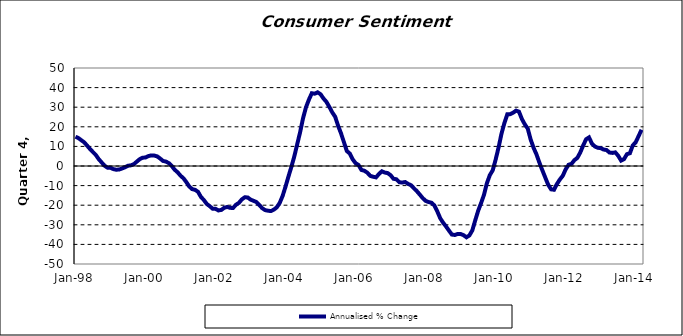
| Category | Annualised % Change |
|---|---|
| 1998-01-01 | 14.944 |
| 1998-02-01 | 14.272 |
| 1998-03-01 | 13.138 |
| 1998-04-01 | 12.079 |
| 1998-05-01 | 10.382 |
| 1998-06-01 | 8.64 |
| 1998-07-01 | 7.113 |
| 1998-08-01 | 5.581 |
| 1998-09-01 | 3.453 |
| 1998-10-01 | 1.768 |
| 1998-11-01 | 0.134 |
| 1998-12-01 | -0.855 |
| 1999-01-01 | -0.929 |
| 1999-02-01 | -1.592 |
| 1999-03-01 | -1.901 |
| 1999-04-01 | -1.779 |
| 1999-05-01 | -1.259 |
| 1999-06-01 | -0.631 |
| 1999-07-01 | 0.124 |
| 1999-08-01 | 0.339 |
| 1999-09-01 | 0.926 |
| 1999-10-01 | 2.203 |
| 1999-11-01 | 3.457 |
| 1999-12-01 | 4.242 |
| 2000-01-01 | 4.316 |
| 2000-02-01 | 5.062 |
| 2000-03-01 | 5.412 |
| 2000-04-01 | 5.336 |
| 2000-05-01 | 4.906 |
| 2000-06-01 | 3.835 |
| 2000-07-01 | 2.582 |
| 2000-08-01 | 2.254 |
| 2000-09-01 | 1.461 |
| 2000-10-01 | 0.012 |
| 2000-11-01 | -1.901 |
| 2000-12-01 | -3.183 |
| 2001-01-01 | -4.932 |
| 2001-02-01 | -6.257 |
| 2001-03-01 | -8.221 |
| 2001-04-01 | -10.457 |
| 2001-05-01 | -11.805 |
| 2001-06-01 | -12.157 |
| 2001-07-01 | -13.164 |
| 2001-08-01 | -15.776 |
| 2001-09-01 | -17.361 |
| 2001-10-01 | -19.349 |
| 2001-11-01 | -20.479 |
| 2001-12-01 | -21.784 |
| 2002-01-01 | -21.847 |
| 2002-02-01 | -22.669 |
| 2002-03-01 | -22.409 |
| 2002-04-01 | -21.303 |
| 2002-05-01 | -20.9 |
| 2002-06-01 | -21.354 |
| 2002-07-01 | -21.407 |
| 2002-08-01 | -19.799 |
| 2002-09-01 | -18.817 |
| 2002-10-01 | -17.075 |
| 2002-11-01 | -15.988 |
| 2002-12-01 | -16.023 |
| 2003-01-01 | -17.125 |
| 2003-02-01 | -17.75 |
| 2003-03-01 | -18.381 |
| 2003-04-01 | -19.905 |
| 2003-05-01 | -21.525 |
| 2003-06-01 | -22.518 |
| 2003-07-01 | -22.815 |
| 2003-08-01 | -22.997 |
| 2003-09-01 | -22.249 |
| 2003-10-01 | -21.081 |
| 2003-11-01 | -18.829 |
| 2003-12-01 | -15.263 |
| 2004-01-01 | -10.492 |
| 2004-02-01 | -5.344 |
| 2004-03-01 | -0.419 |
| 2004-04-01 | 4.897 |
| 2004-05-01 | 11.114 |
| 2004-06-01 | 17.3 |
| 2004-07-01 | 24.4 |
| 2004-08-01 | 29.944 |
| 2004-09-01 | 33.849 |
| 2004-10-01 | 37.119 |
| 2004-11-01 | 36.895 |
| 2004-12-01 | 37.583 |
| 2005-01-01 | 36.609 |
| 2005-02-01 | 34.456 |
| 2005-03-01 | 32.735 |
| 2005-04-01 | 30.157 |
| 2005-05-01 | 27.387 |
| 2005-06-01 | 25.128 |
| 2005-07-01 | 20.582 |
| 2005-08-01 | 16.696 |
| 2005-09-01 | 12.184 |
| 2005-10-01 | 7.655 |
| 2005-11-01 | 6.357 |
| 2005-12-01 | 3.411 |
| 2006-01-01 | 1.434 |
| 2006-02-01 | 0.517 |
| 2006-03-01 | -2.005 |
| 2006-04-01 | -2.416 |
| 2006-05-01 | -3.372 |
| 2006-06-01 | -5.012 |
| 2006-07-01 | -5.486 |
| 2006-08-01 | -5.799 |
| 2006-09-01 | -4.076 |
| 2006-10-01 | -2.707 |
| 2006-11-01 | -3.35 |
| 2006-12-01 | -3.616 |
| 2007-01-01 | -4.695 |
| 2007-02-01 | -6.539 |
| 2007-03-01 | -6.772 |
| 2007-04-01 | -8.285 |
| 2007-05-01 | -8.453 |
| 2007-06-01 | -8.168 |
| 2007-07-01 | -9.144 |
| 2007-08-01 | -9.795 |
| 2007-09-01 | -11.377 |
| 2007-10-01 | -12.84 |
| 2007-11-01 | -14.581 |
| 2007-12-01 | -16.37 |
| 2008-01-01 | -17.765 |
| 2008-02-01 | -18.371 |
| 2008-03-01 | -18.748 |
| 2008-04-01 | -20.101 |
| 2008-05-01 | -23.142 |
| 2008-06-01 | -26.638 |
| 2008-07-01 | -28.92 |
| 2008-08-01 | -30.854 |
| 2008-09-01 | -32.941 |
| 2008-10-01 | -34.968 |
| 2008-11-01 | -35.199 |
| 2008-12-01 | -34.659 |
| 2009-01-01 | -34.693 |
| 2009-02-01 | -35.301 |
| 2009-03-01 | -36.373 |
| 2009-04-01 | -35.417 |
| 2009-05-01 | -32.854 |
| 2009-06-01 | -27.764 |
| 2009-07-01 | -22.894 |
| 2009-08-01 | -18.954 |
| 2009-09-01 | -14.709 |
| 2009-10-01 | -8.802 |
| 2009-11-01 | -4.676 |
| 2009-12-01 | -2.178 |
| 2010-01-01 | 3.258 |
| 2010-02-01 | 9.428 |
| 2010-03-01 | 16.468 |
| 2010-04-01 | 21.936 |
| 2010-05-01 | 26.379 |
| 2010-06-01 | 26.459 |
| 2010-07-01 | 27.206 |
| 2010-08-01 | 28.251 |
| 2010-09-01 | 27.701 |
| 2010-10-01 | 23.973 |
| 2010-11-01 | 21.235 |
| 2010-12-01 | 19.072 |
| 2011-01-01 | 13.518 |
| 2011-02-01 | 9.291 |
| 2011-03-01 | 5.896 |
| 2011-04-01 | 1.688 |
| 2011-05-01 | -2.15 |
| 2011-06-01 | -5.872 |
| 2011-07-01 | -9.538 |
| 2011-08-01 | -11.901 |
| 2011-09-01 | -12.112 |
| 2011-10-01 | -9.193 |
| 2011-11-01 | -6.891 |
| 2011-12-01 | -5.023 |
| 2012-01-01 | -1.685 |
| 2012-02-01 | 0.618 |
| 2012-03-01 | 1.122 |
| 2012-04-01 | 2.991 |
| 2012-05-01 | 4.149 |
| 2012-06-01 | 6.911 |
| 2012-07-01 | 10.466 |
| 2012-08-01 | 13.657 |
| 2012-09-01 | 14.587 |
| 2012-10-01 | 11.403 |
| 2012-11-01 | 9.995 |
| 2012-12-01 | 9.284 |
| 2013-01-01 | 9.145 |
| 2013-02-01 | 8.412 |
| 2013-03-01 | 8.152 |
| 2013-04-01 | 6.89 |
| 2013-05-01 | 6.678 |
| 2013-06-01 | 6.95 |
| 2013-07-01 | 5.241 |
| 2013-08-01 | 2.75 |
| 2013-09-01 | 3.525 |
| 2013-10-01 | 6.044 |
| 2013-11-01 | 6.504 |
| 2013-12-01 | 10.524 |
| 2014-01-01 | 12.122 |
| 2014-02-01 | 15.287 |
| 2014-03-01 | 18.498 |